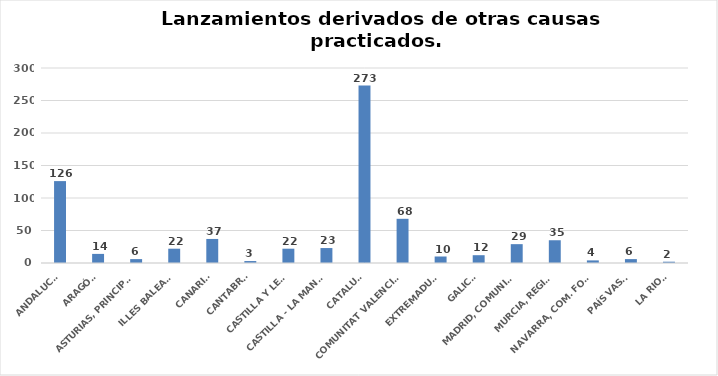
| Category | Series 0 |
|---|---|
| ANDALUCÍA | 126 |
| ARAGÓN | 14 |
| ASTURIAS, PRINCIPADO | 6 |
| ILLES BALEARS | 22 |
| CANARIAS | 37 |
| CANTABRIA | 3 |
| CASTILLA Y LEÓN | 22 |
| CASTILLA - LA MANCHA | 23 |
| CATALUÑA | 273 |
| COMUNITAT VALENCIANA | 68 |
| EXTREMADURA | 10 |
| GALICIA | 12 |
| MADRID, COMUNIDAD | 29 |
| MURCIA, REGIÓN | 35 |
| NAVARRA, COM. FORAL | 4 |
| PAÍS VASCO | 6 |
| LA RIOJA | 2 |